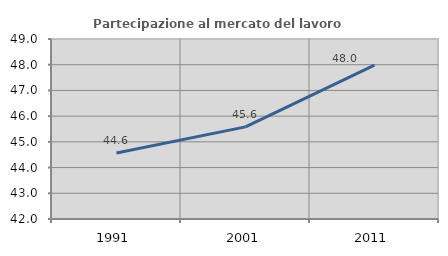
| Category | Partecipazione al mercato del lavoro  femminile |
|---|---|
| 1991.0 | 44.57 |
| 2001.0 | 45.582 |
| 2011.0 | 47.985 |